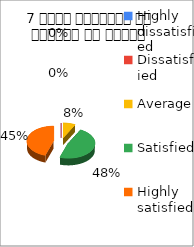
| Category | 7 विषय अवधारणा पर शिक्षक का ज्ञान  |
|---|---|
| Highly dissatisfied | 0 |
| Dissatisfied | 0 |
| Average | 3 |
| Satisfied | 19 |
| Highly satisfied | 18 |